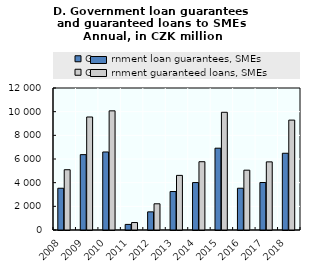
| Category | Government loan guarantees, SMEs | Government guaranteed loans, SMEs |
|---|---|---|
| 2008.0 | 3529 | 5094 |
| 2009.0 | 6369 | 9550 |
| 2010.0 | 6593 | 10070 |
| 2011.0 | 472 | 630 |
| 2012.0 | 1534 | 2215 |
| 2013.0 | 3251 | 4616 |
| 2014.0 | 4010 | 5771 |
| 2015.0 | 6913 | 9947 |
| 2016.0 | 3530 | 5055 |
| 2017.0 | 4014 | 5758 |
| 2018.0 | 6485 | 9287 |